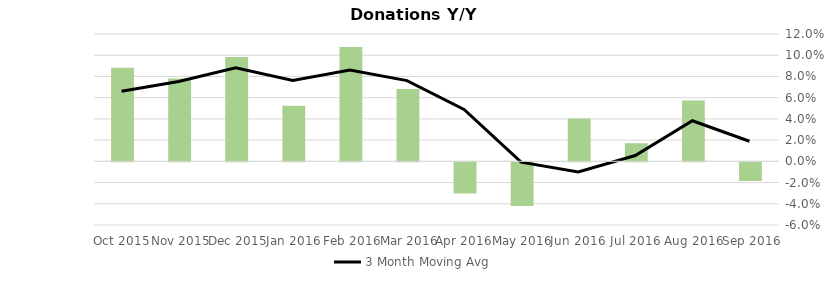
| Category | Donation Index Amount Y/Y Growth |
|---|---|
| Sep 2016 | -0.018 |
| Aug 2016 | 0.057 |
| Jul 2016 | 0.017 |
| Jun 2016 | 0.04 |
| May 2016 | -0.041 |
| Apr 2016 | -0.029 |
| Mar 2016 | 0.068 |
| Feb 2016 | 0.108 |
| Jan 2016 | 0.052 |
| Dec 2015 | 0.098 |
| Nov 2015 | 0.078 |
| Oct 2015 | 0.088 |